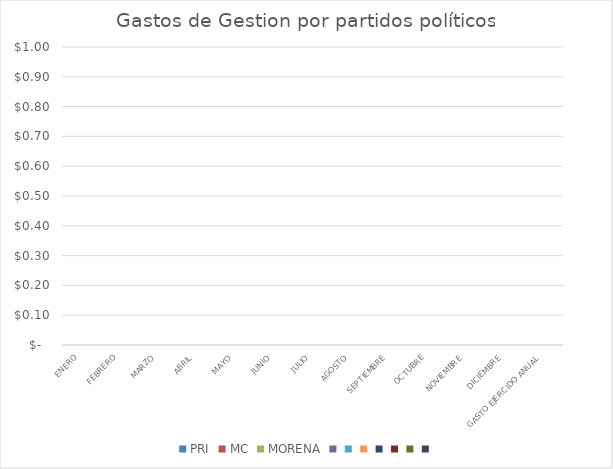
| Category | PRI | MC | MORENA | Series 3 | Series 4 | Series 5 | Series 6 | Series 7 | Series 8 | Series 9 |
|---|---|---|---|---|---|---|---|---|---|---|
| ENERO | 0 | 0 | 0 | 0 | 0 | 0 | 0 | 0 | 0 | 0 |
| FEBRERO | 0 | 0 | 0 | 0 | 0 | 0 | 0 | 0 | 0 | 0 |
| MARZO | 0 | 0 | 0 | 0 | 0 | 0 | 0 | 0 | 0 | 0 |
| ABRIL | 0 | 0 | 0 | 0 | 0 | 0 | 0 | 0 | 0 | 0 |
| MAYO | 0 | 0 | 0 | 0 | 0 | 0 | 0 | 0 | 0 | 0 |
| JUNIO | 0 | 0 | 0 | 0 | 0 | 0 | 0 | 0 | 0 | 0 |
|  JULIO | 0 | 0 | 0 | 0 | 0 | 0 | 0 | 0 | 0 | 0 |
|  AGOSTO | 0 | 0 | 0 | 0 | 0 | 0 | 0 | 0 | 0 | 0 |
| SEPTIEMBRE | 0 | 0 | 0 | 0 | 0 | 0 | 0 | 0 | 0 | 0 |
| OCTUBRE | 0 | 0 | 0 | 0 | 0 | 0 | 0 | 0 | 0 | 0 |
| NOVIEMBRE | 0 | 0 | 0 | 0 | 0 | 0 | 0 | 0 | 0 | 0 |
| DICIEMBRE | 0 | 0 | 0 | 0 | 0 | 0 | 0 | 0 | 0 | 0 |
| GASTO EJERCIDO ANUAL | 0 | 0 | 0 | 0 | 0 | 0 | 0 | 0 | 0 | 0 |